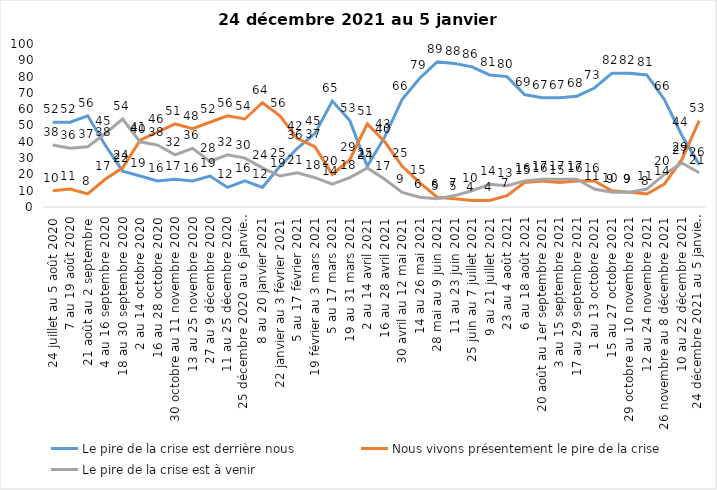
| Category | Le pire de la crise est derrière nous | Nous vivons présentement le pire de la crise | Le pire de la crise est à venir |
|---|---|---|---|
| 24 juillet au 5 août 2020 | 52 | 10 | 38 |
| 7 au 19 août 2020 | 52 | 11 | 36 |
| 21 août au 2 septembre | 56 | 8 | 37 |
| 4 au 16 septembre 2020 | 38 | 17 | 45 |
| 18 au 30 septembre 2020 | 22 | 24 | 54 |
| 2 au 14 octobre 2020 | 19 | 41 | 40 |
| 16 au 28 octobre 2020 | 16 | 46 | 38 |
| 30 octobre au 11 novembre 2020 | 17 | 51 | 32 |
| 13 au 25 novembre 2020 | 16 | 48 | 36 |
| 27 au 9 décembre 2020 | 19 | 52 | 28 |
| 11 au 25 décembre 2020 | 12 | 56 | 32 |
| 25 décembre 2020 au 6 janvier 2021 | 16 | 54 | 30 |
| 8 au 20 janvier 2021 | 12 | 64 | 24 |
| 22 janvier au 3 février 2021 | 25 | 56 | 19 |
| 5 au 17 février 2021 | 36 | 42 | 21 |
| 19 février au 3 mars 2021 | 45 | 37 | 18 |
| 5 au 17 mars 2021 | 65 | 20 | 14 |
| 19 au 31 mars 2021 | 53 | 29 | 18 |
| 2 au 14 avril 2021 | 25 | 51 | 24 |
| 16 au 28 avril 2021 | 43 | 40 | 17 |
| 30 avril au 12 mai 2021 | 66 | 25 | 9 |
| 14 au 26 mai 2021 | 79 | 15 | 6 |
| 28 mai au 9 juin 2021 | 89 | 6 | 5 |
| 11 au 23 juin 2021 | 88 | 5 | 7 |
| 25 juin au 7 juillet 2021 | 86 | 4 | 10 |
| 9 au 21 juillet 2021 | 81 | 4 | 14 |
| 23 au 4 août 2021 | 80 | 7 | 13 |
| 6 au 18 août 2021 | 69 | 15 | 16 |
| 20 août au 1er septembre 2021 | 67 | 16 | 17 |
| 3 au 15 septembre 2021 | 67 | 15 | 17 |
| 17 au 29 septembre 2021 | 68 | 16 | 17 |
| 1 au 13 octobre 2021 | 73 | 16 | 11 |
| 15 au 27 octobre 2021 | 82 | 10 | 9 |
| 29 octobre au 10 novembre 2021 | 82 | 9 | 9 |
| 12 au 24 novembre 2021 | 81 | 8 | 11 |
| 26 novembre au 8 décembre 2021 | 66 | 14 | 20 |
| 10 au 22 décembre 2021 | 44 | 29 | 27 |
| 24 décembre 2021 au 5 janvier 2022 | 26 | 53 | 21 |